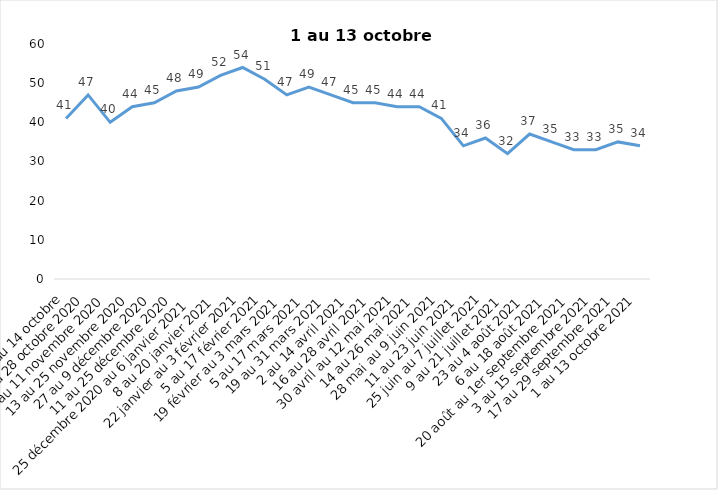
| Category | Toujours aux trois mesures |
|---|---|
| 2 au 14 octobre | 41 |
| 16 au 28 octobre 2020 | 47 |
| 30 octobre au 11 novembre 2020 | 40 |
| 13 au 25 novembre 2020 | 44 |
| 27 au 9 décembre 2020 | 45 |
| 11 au 25 décembre 2020 | 48 |
| 25 décembre 2020 au 6 janvier 2021 | 49 |
| 8 au 20 janvier 2021 | 52 |
| 22 janvier au 3 février 2021 | 54 |
| 5 au 17 février 2021 | 51 |
| 19 février au 3 mars 2021 | 47 |
| 5 au 17 mars 2021 | 49 |
| 19 au 31 mars 2021 | 47 |
| 2 au 14 avril 2021 | 45 |
| 16 au 28 avril 2021 | 45 |
| 30 avril au 12 mai 2021 | 44 |
| 14 au 26 mai 2021 | 44 |
| 28 mai au 9 juin 2021 | 41 |
| 11 au 23 juin 2021 | 34 |
| 25 juin au 7 juillet 2021 | 36 |
| 9 au 21 juillet 2021 | 32 |
| 23 au 4 août 2021 | 37 |
| 6 au 18 août 2021 | 35 |
| 20 août au 1er septembre 2021 | 33 |
| 3 au 15 septembre 2021 | 33 |
| 17 au 29 septembre 2021 | 35 |
| 1 au 13 octobre 2021 | 34 |